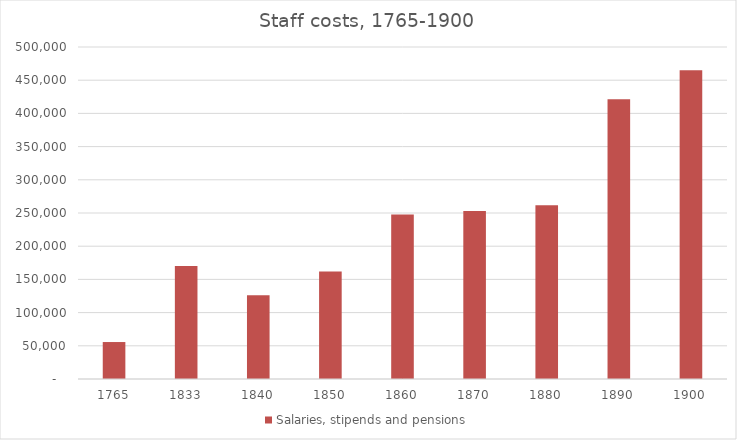
| Category | Salaries, stipends and pensions |
|---|---|
| 1765.0 | 55680 |
| 1833.0 | 170124 |
| 1840.0 | 126060 |
| 1850.0 | 162060 |
| 1860.0 | 247920 |
| 1870.0 | 252952 |
| 1880.0 | 261501 |
| 1890.0 | 421344 |
| 1900.0 | 464901 |